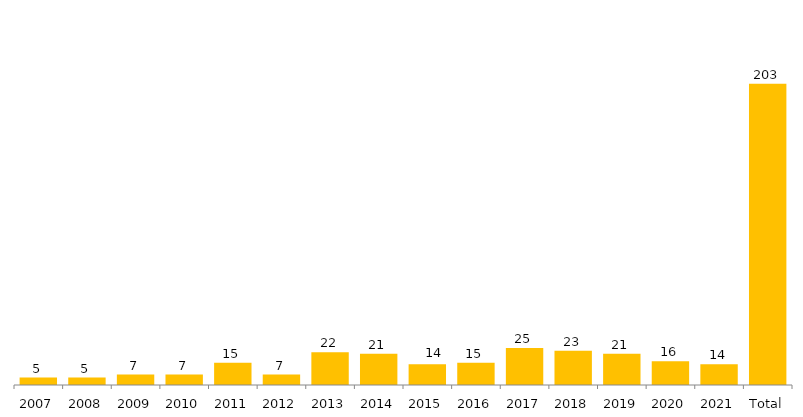
| Category | Total Geral |
|---|---|
| 2007 | 5 |
| 2008 | 5 |
| 2009 | 7 |
| 2010 | 7 |
| 2011 | 15 |
| 2012 | 7 |
| 2013 | 22 |
| 2014 | 21 |
| 2015 | 14 |
| 2016 | 15 |
| 2017 | 25 |
| 2018 | 23 |
| 2019 | 21 |
| 2020 | 16 |
| 2021 | 14 |
| Total | 203 |